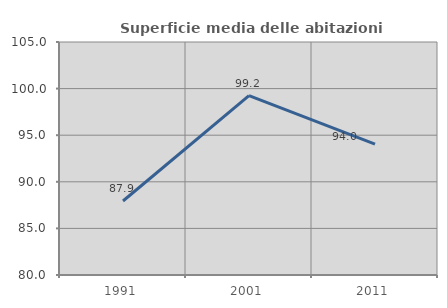
| Category | Superficie media delle abitazioni occupate |
|---|---|
| 1991.0 | 87.938 |
| 2001.0 | 99.236 |
| 2011.0 | 94.034 |